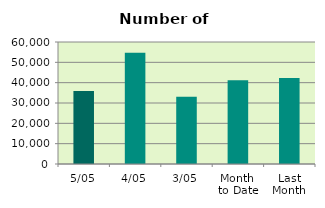
| Category | Series 0 |
|---|---|
| 5/05 | 35950 |
| 4/05 | 54676 |
| 3/05 | 33106 |
| Month 
to Date | 41244 |
| Last
Month | 42252.3 |